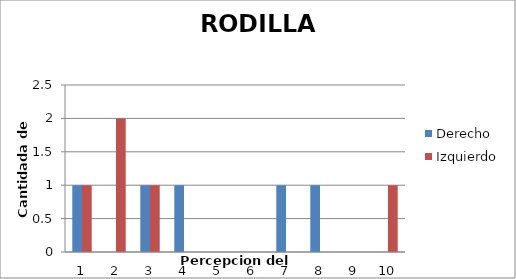
| Category | Derecho  | Izquierdo |
|---|---|---|
| 0 | 1 | 1 |
| 1 | 0 | 2 |
| 2 | 1 | 1 |
| 3 | 1 | 0 |
| 4 | 0 | 0 |
| 5 | 0 | 0 |
| 6 | 1 | 0 |
| 7 | 1 | 0 |
| 8 | 0 | 0 |
| 9 | 0 | 1 |